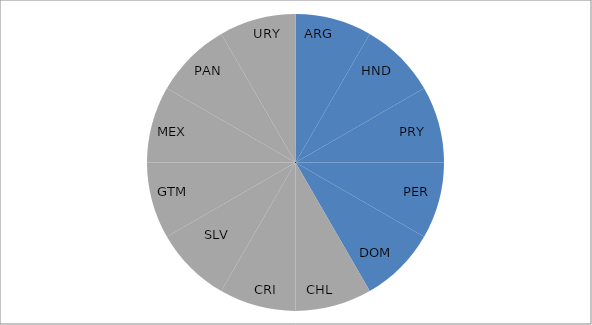
| Category | Series 0 |
|---|---|
| Argentina | 1 |
| Honduras | 1 |
| Paraguay  | 1 |
| Peru | 1 |
| Dominican Republic | 1 |
| Chile | 1 |
| Costa Rica | 1 |
| El Salvador | 1 |
| Guatemala | 1 |
| Mexico | 1 |
| Panama | 1 |
| Uruguay | 1 |